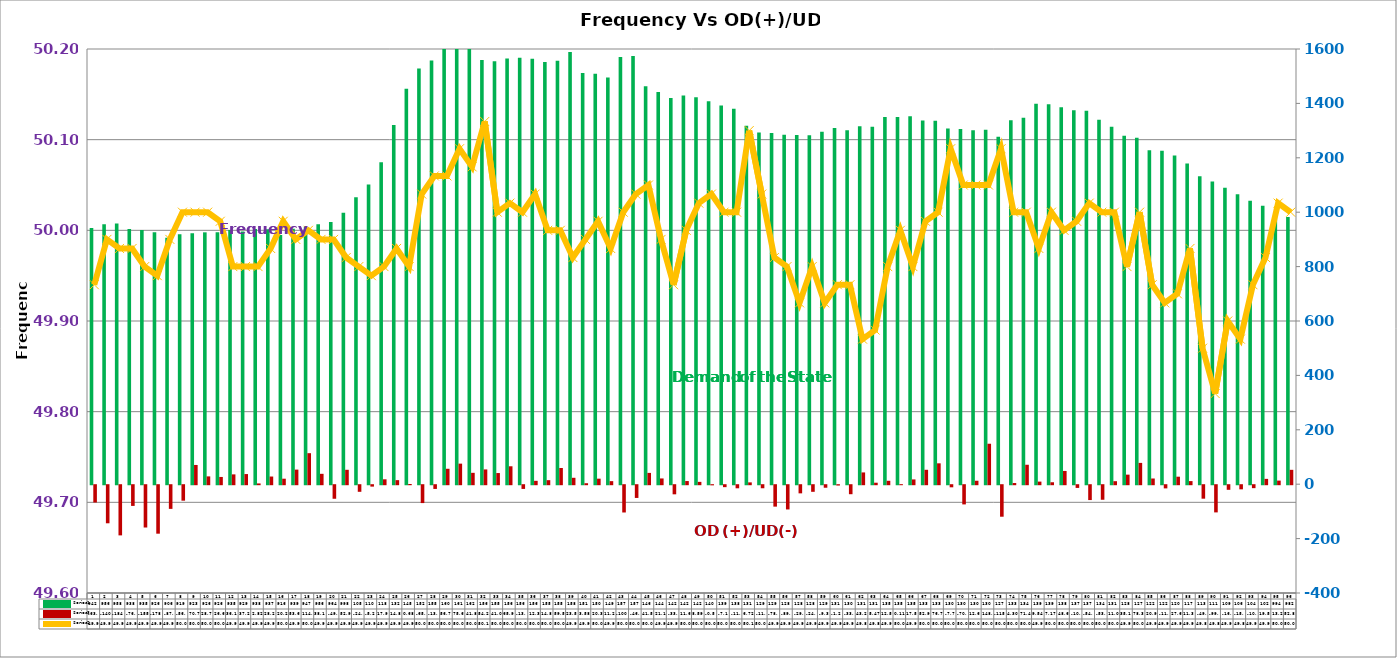
| Category | Series 2 | Series 4 |
|---|---|---|
| 0 | 942 | -63.644 |
| 1 | 956 | -140.033 |
| 2 | 958 | -184.492 |
| 3 | 938 | -76.151 |
| 4 | 935 | -155.574 |
| 5 | 926 | -178.251 |
| 6 | 906 | -87.047 |
| 7 | 919 | -56.917 |
| 8 | 923 | 70.739 |
| 9 | 926 | 28.727 |
| 10 | 926 | 26.626 |
| 11 | 935 | 36.126 |
| 12 | 929 | 37.269 |
| 13 | 938 | 2.819 |
| 14 | 937 | 28.201 |
| 15 | 916 | 20.201 |
| 16 | 939 | 53.623 |
| 17 | 947 | 114.07 |
| 18 | 956 | 38.161 |
| 19 | 964 | -49.865 |
| 20 | 998 | 52.955 |
| 21 | 1055 | -24.292 |
| 22 | 1102 | -5.209 |
| 23 | 1184 | 17.95 |
| 24 | 1321 | 14.879 |
| 25 | 1454 | 0.684 |
| 26 | 1528 | -65.758 |
| 27 | 1558 | -13.713 |
| 28 | 1608.067 | 56.74 |
| 29 | 1612.667 | 75.6 |
| 30 | 1624.333 | 41.819 |
| 31 | 1560 | 54.283 |
| 32 | 1555 | 41.015 |
| 33 | 1565 | 65.896 |
| 34 | 1568 | -13.675 |
| 35 | 1564 | 12.381 |
| 36 | 1552 | 14.803 |
| 37 | 1557 | 59.556 |
| 38 | 1589 | 23.579 |
| 39 | 1512 | 3.585 |
| 40 | 1509 | 20.323 |
| 41 | 1495 | 11.228 |
| 42 | 1571 | -100.29 |
| 43 | 1574 | -46.84 |
| 44 | 1463 | 41.539 |
| 45 | 1442 | 21.144 |
| 46 | 1420 | -33.512 |
| 47 | 1429 | 11.614 |
| 48 | 1423 | 8.594 |
| 49 | 1408 | -0.562 |
| 50 | 1392 | -7.182 |
| 51 | 1380 | -11.372 |
| 52 | 1318 | 6.718 |
| 53 | 1293 | -11.232 |
| 54 | 1291 | -78.776 |
| 55 | 1285 | -89.186 |
| 56 | 1284 | -29.966 |
| 57 | 1283 | -24.32 |
| 58 | 1296 | -9.32 |
| 59 | 1310 | -1.272 |
| 60 | 1301 | -33.144 |
| 61 | 1316 | 43.278 |
| 62 | 1314 | 5.469 |
| 63 | 1350 | 12.529 |
| 64 | 1350 | 0.114 |
| 65 | 1353 | 17.554 |
| 66 | 1337 | 52.992 |
| 67 | 1336 | 76.779 |
| 68 | 1308 | -7.76 |
| 69 | 1306 | -70.619 |
| 70 | 1301 | 12.684 |
| 71 | 1303 | 148.768 |
| 72 | 1277 | -115.862 |
| 73 | 1338 | 4.3 |
| 74 | 1347 | 71.466 |
| 75 | 1399 | 9.537 |
| 76 | 1397 | 7.174 |
| 77 | 1386 | 48.689 |
| 78 | 1375 | -10.007 |
| 79 | 1373 | -54.631 |
| 80 | 1340 | -53.519 |
| 81 | 1314 | 11.055 |
| 82 | 1281 | 35.12 |
| 83 | 1274 | 78.359 |
| 84 | 1228 | 20.941 |
| 85 | 1226 | -11.716 |
| 86 | 1208 | 27.612 |
| 87 | 1179 | 11.385 |
| 88 | 1132 | -49.581 |
| 89 | 1113 | -99.995 |
| 90 | 1090 | -16.945 |
| 91 | 1066 | -15.213 |
| 92 | 1042 | -10.866 |
| 93 | 1024 | 19.59 |
| 94 | 994 | 13.227 |
| 95 | 982 | 52.845 |